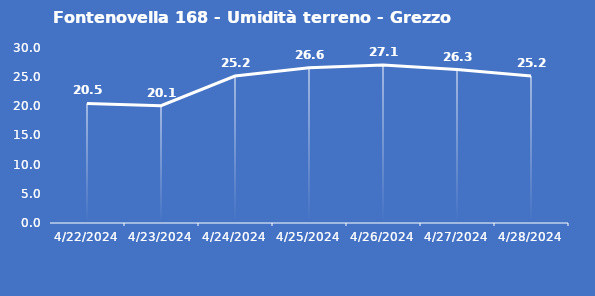
| Category | Fontenovella 168 - Umidità terreno - Grezzo (%VWC) |
|---|---|
| 4/22/24 | 20.5 |
| 4/23/24 | 20.1 |
| 4/24/24 | 25.2 |
| 4/25/24 | 26.6 |
| 4/26/24 | 27.1 |
| 4/27/24 | 26.3 |
| 4/28/24 | 25.2 |